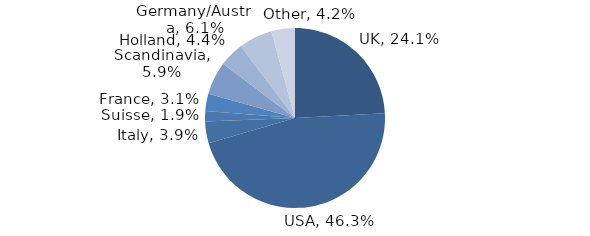
| Category | Investment Style |
|---|---|
| UK | 0.241 |
| USA | 0.463 |
| Italy | 0.039 |
| Suisse | 0.019 |
| France | 0.031 |
| Scandinavia | 0.059 |
| Holland | 0.044 |
| Germany/Austria | 0.061 |
| Other | 0.042 |